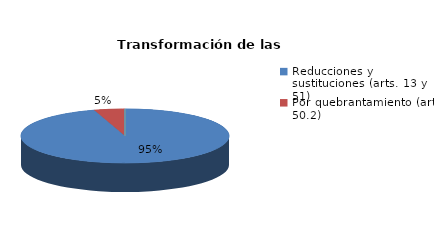
| Category | Series 0 |
|---|---|
| Reducciones y sustituciones (arts. 13 y 51) | 20 |
| Por quebrantamiento (art. 50.2) | 1 |
| Cancelaciones anticipadas | 0 |
| Traslado a Centros Penitenciarios | 0 |
| Conversión internamientos en cerrados (art. 51.2) | 0 |